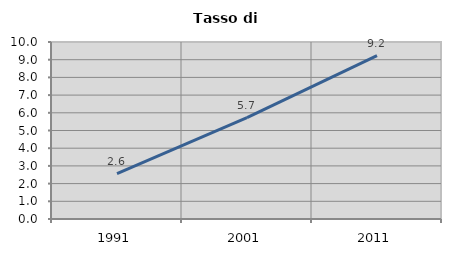
| Category | Tasso di disoccupazione   |
|---|---|
| 1991.0 | 2.564 |
| 2001.0 | 5.729 |
| 2011.0 | 9.231 |